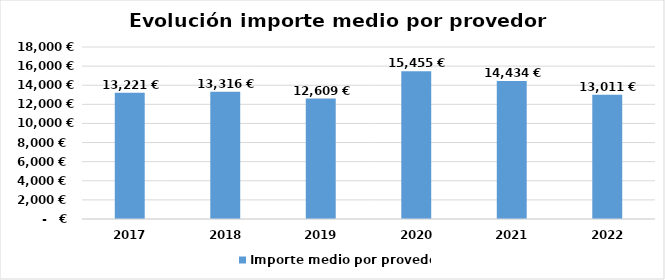
| Category | Importe medio por provedor |
|---|---|
| 2017.0 | 13220.593 |
| 2018.0 | 13316.472 |
| 2019.0 | 12608.521 |
| 2020.0 | 15455.475 |
| 2021.0 | 14434.42 |
| 2022.0 | 13010.65 |